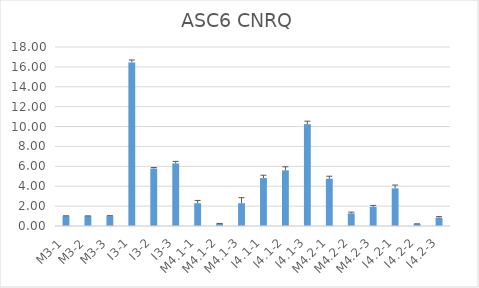
| Category | ASC6 CNRQ |
|---|---|
| M3-1 | 1 |
| M3-2 | 1 |
| M3-3 | 1 |
| I3-1 | 16.45 |
| I3-2 | 5.78 |
| I3-3 | 6.29 |
| M4.1-1 | 2.291 |
| M4.1-2 | 0.234 |
| M4.1-3 | 2.29 |
| I4.1-1 | 4.819 |
| I4.1-2 | 5.596 |
| I4.1-3 | 10.24 |
| M4.2-1 | 4.751 |
| M4.2-2 | 1.265 |
| M4.2-3 | 1.92 |
| I4.2-1 | 3.786 |
| I4.2-2 | 0.194 |
| I4.2-3 | 0.84 |